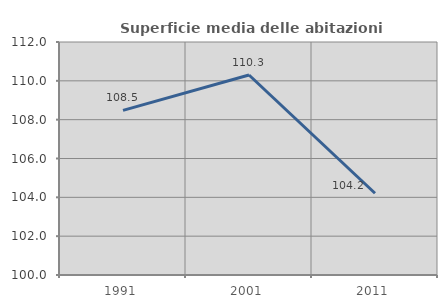
| Category | Superficie media delle abitazioni occupate |
|---|---|
| 1991.0 | 108.481 |
| 2001.0 | 110.301 |
| 2011.0 | 104.211 |